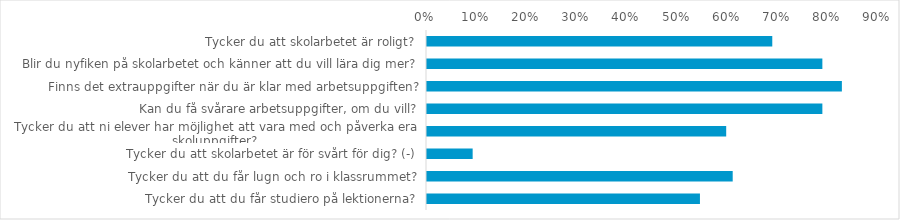
| Category | (Alla) |
|---|---|
| Tycker du att skolarbetet är roligt? | 0.688 |
| Blir du nyfiken på skolarbetet och känner att du vill lära dig mer? | 0.787 |
| Finns det extrauppgifter när du är klar med arbetsuppgiften? | 0.826 |
| Kan du få svårare arbetsuppgifter, om du vill? | 0.787 |
| Tycker du att ni elever har möjlighet att vara med och påverka era skoluppgifter? | 0.596 |
| Tycker du att skolarbetet är för svårt för dig? (-) | 0.091 |
| Tycker du att du får lugn och ro i klassrummet? | 0.609 |
| Tycker du att du får studiero på lektionerna? | 0.543 |